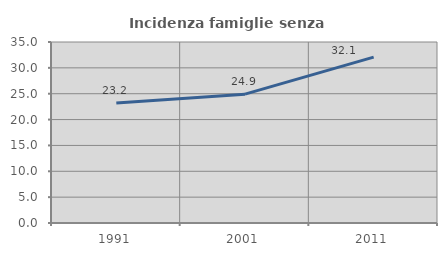
| Category | Incidenza famiglie senza nuclei |
|---|---|
| 1991.0 | 23.21 |
| 2001.0 | 24.913 |
| 2011.0 | 32.08 |